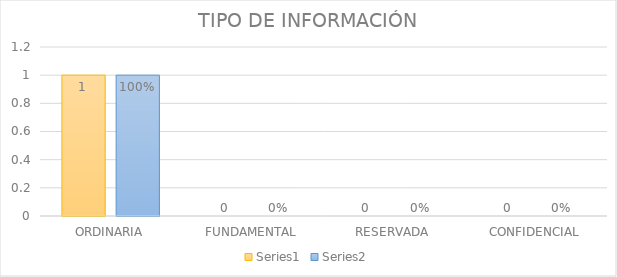
| Category | Series 3 | Series 4 |
|---|---|---|
| ORDINARIA | 1 | 1 |
| FUNDAMENTAL | 0 | 0 |
| RESERVADA | 0 | 0 |
| CONFIDENCIAL | 0 | 0 |